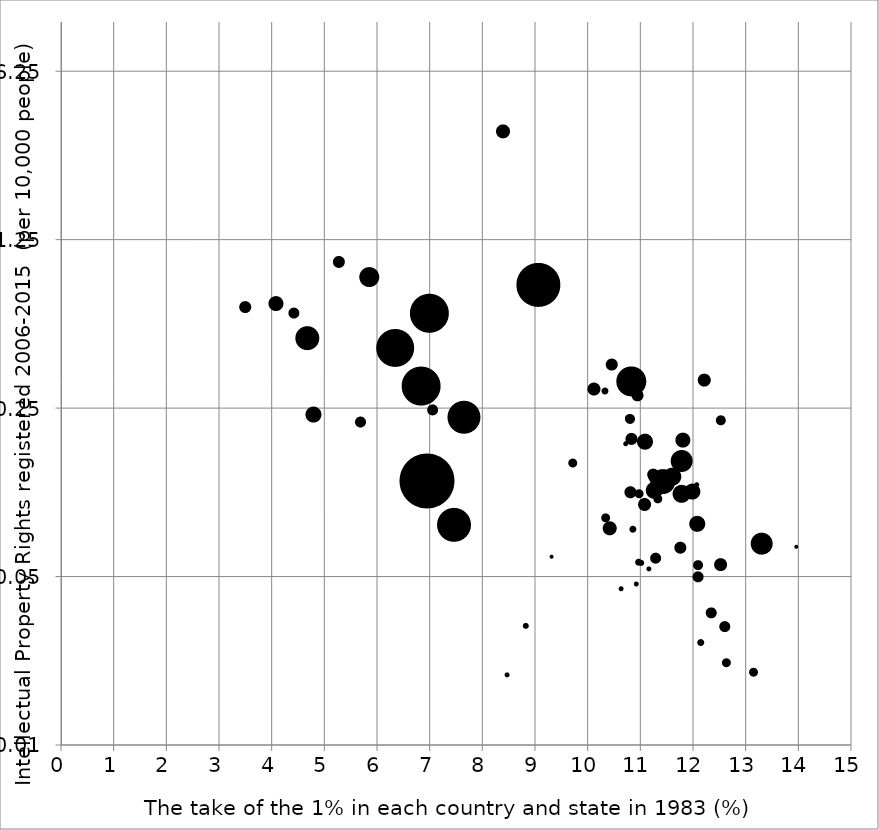
| Category | Series 0 |
|---|---|
| 12.342149 | 0.035 |
| 8.4618807 | 0.02 |
| 11.272208 | 0.13 |
| 12.627508 | 0.022 |
| 10.827101 | 0.323 |
| 10.823525 | 0.187 |
| 12.519849 | 0.223 |
| 10.718918 | 0.178 |
| 13.960412 | 0.066 |
| 13.298127 | 0.069 |
| 12.073452 | 0.083 |
| 8.8225587 | 0.031 |
| 10.319641 | 0.296 |
| 11.599077 | 0.13 |
| 11.073858 | 0.1 |
| 10.971814 | 0.111 |
| 11.324685 | 0.105 |
| 12.086685 | 0.05 |
| 12.596983 | 0.031 |
| 11.013192 | 0.057 |
| 10.809328 | 0.112 |
| 12.208504 | 0.328 |
| 11.079764 | 0.182 |
| 10.938519 | 0.283 |
| 13.142256 | 0.02 |
| 11.757833 | 0.066 |
| 10.921436 | 0.047 |
| 10.963338 | 0.057 |
| 10.332483 | 0.088 |
| 10.759662 | 0.228 |
| 11.801322 | 0.185 |
| 10.857477 | 0.079 |
| 11.7783 | 0.151 |
| 11.979431 | 0.113 |
| 11.154256 | 0.054 |
| 11.258063 | 0.114 |
| 12.09054 | 0.056 |
| 10.800268 | 0.226 |
| 11.774806 | 0.111 |
| 12.069936 | 0.12 |
| 11.285991 | 0.06 |
| 10.630249 | 0.045 |
| 12.516923 | 0.056 |
| 11.42572 | 0.124 |
| 9.7092366 | 0.148 |
| 10.723032 | 0.349 |
| 10.41725 | 0.079 |
| 10.116898 | 0.3 |
| 12.142691 | 0.027 |
| 11.23925 | 0.133 |
| 9.311722 | 0.061 |
| 4.67 | 0.489 |
| 7.7 | 0.011 |
| 5.27 | 1.013 |
| 3.49 | 0.659 |
| 6.99 | 0.62 |
| 9.06 | 0.813 |
| 7.05 | 0.246 |
| 6.34 | 0.445 |
| 6.94 | 0.125 |
| 7.46 | 0.082 |
| 5.85 | 0.876 |
| 5.68 | 0.22 |
| 4.42 | 0.62 |
| 4.79 | 0.235 |
| 10.45 | 0.38 |
| 7.65 | 0.229 |
| 4.08 | 0.679 |
| 8.39 | 3.521 |
| 6.83 | 0.31 |